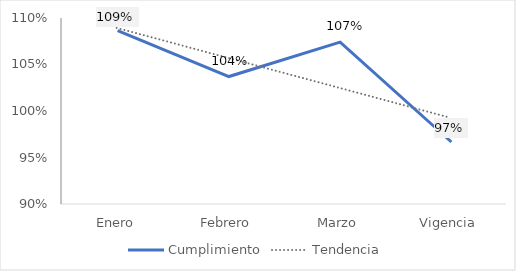
| Category | Cumplimiento |
|---|---|
| Enero | 1.086 |
| Febrero | 1.037 |
| Marzo | 1.074 |
| Vigencia | 0.967 |